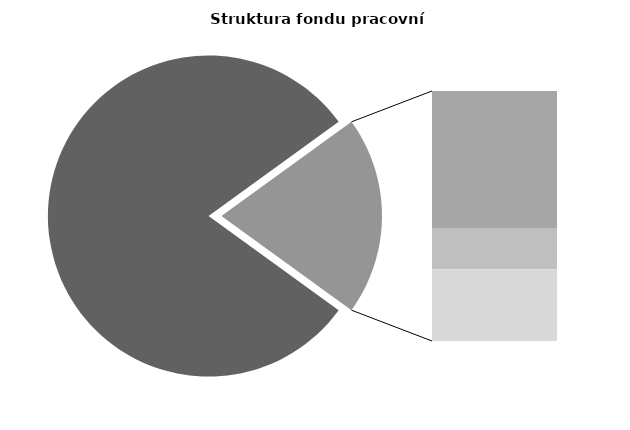
| Category | Series 0 |
|---|---|
| Průměrná měsíční odpracovaná doba bez přesčasu | 138.546 |
| Dovolená | 19.038 |
| Nemoc | 5.567 |
| Jiné | 9.924 |